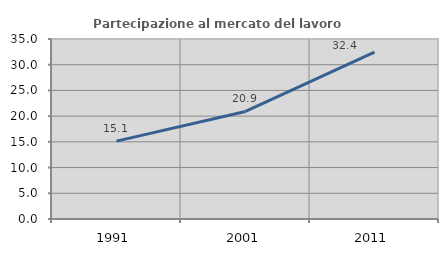
| Category | Partecipazione al mercato del lavoro  femminile |
|---|---|
| 1991.0 | 15.139 |
| 2001.0 | 20.913 |
| 2011.0 | 32.426 |